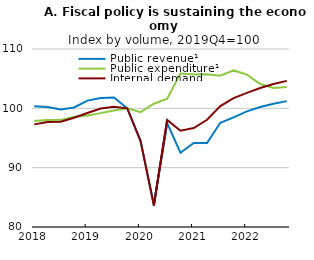
| Category | Public revenue¹ | Public expenditure¹ | Internal demand |
|---|---|---|---|
| 2018-01-01 | 100.357 | 97.871 | 97.298 |
| 2018-04-01 | 100.227 | 98.04 | 97.709 |
| 2018-07-01 | 99.804 | 98.028 | 97.742 |
| 2018-10-01 | 100.14 | 98.579 | 98.404 |
| 2019-01-01 | 101.305 | 98.805 | 99.219 |
| 2019-04-01 | 101.737 | 99.193 | 99.969 |
| 2019-07-01 | 101.839 | 99.648 | 100.282 |
| 2019-10-01 | 100 | 100 | 100 |
| 2020-01-01 | 94.447 | 99.365 | 94.52 |
| 2020-04-01 | 83.818 | 100.773 | 83.611 |
| 2020-07-01 | 97.505 | 101.641 | 98.058 |
| 2020-10-01 | 92.524 | 105.858 | 96.22 |
| 2021-01-01 | 94.156 | 105.707 | 96.68 |
| 2021-04-01 | 94.152 | 105.744 | 98.077 |
| 2021-07-01 | 97.565 | 105.505 | 100.374 |
| 2021-10-01 | 98.486 | 106.39 | 101.714 |
| 2022-01-01 | 99.482 | 105.682 | 102.603 |
| 2022-04-01 | 100.216 | 104.106 | 103.416 |
| 2022-07-01 | 100.788 | 103.433 | 104.113 |
| 2022-10-01 | 101.212 | 103.615 | 104.63 |